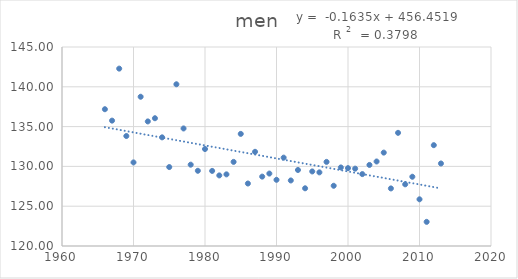
| Category | men |
|---|---|
| 1966.0 | 137.183 |
| 1967.0 | 135.75 |
| 1968.0 | 142.283 |
| 1969.0 | 133.817 |
| 1970.0 | 130.5 |
| 1971.0 | 138.75 |
| 1972.0 | 135.65 |
| 1973.0 | 136.05 |
| 1974.0 | 133.65 |
| 1975.0 | 129.917 |
| 1976.0 | 140.317 |
| 1977.0 | 134.767 |
| 1978.0 | 130.217 |
| 1979.0 | 129.45 |
| 1980.0 | 132.183 |
| 1981.0 | 129.433 |
| 1982.0 | 128.867 |
| 1983.0 | 129 |
| 1984.0 | 130.567 |
| 1985.0 | 134.083 |
| 1986.0 | 127.85 |
| 1987.0 | 131.833 |
| 1988.0 | 128.717 |
| 1989.0 | 129.1 |
| 1990.0 | 128.317 |
| 1991.0 | 131.1 |
| 1992.0 | 128.233 |
| 1993.0 | 129.55 |
| 1994.0 | 127.25 |
| 1995.0 | 129.367 |
| 1996.0 | 129.25 |
| 1997.0 | 130.567 |
| 1998.0 | 127.567 |
| 1999.0 | 129.867 |
| 2000.0 | 129.783 |
| 2001.0 | 129.717 |
| 2002.0 | 129.033 |
| 2003.0 | 130.183 |
| 2004.0 | 130.617 |
| 2005.0 | 131.733 |
| 2006.0 | 127.233 |
| 2007.0 | 134.217 |
| 2008.0 | 127.75 |
| 2009.0 | 128.7 |
| 2010.0 | 125.867 |
| 2011.0 | 123.033 |
| 2012.0 | 132.667 |
| 2013.0 | 130.367 |